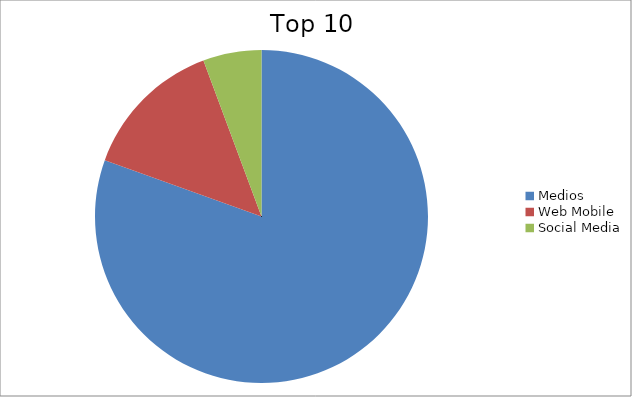
| Category | Series 0 |
|---|---|
| Medios | 80.49 |
| Web Mobile | 13.84 |
| Social Media | 5.67 |